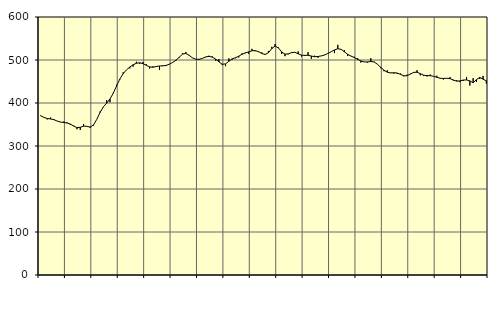
| Category | Piggar | Series 1 |
|---|---|---|
| nan | 371.2 | 370.12 |
| 87.0 | 366.7 | 366.5 |
| 87.0 | 361.9 | 363.95 |
| 87.0 | 366.2 | 362.88 |
| nan | 362.8 | 361.24 |
| 88.0 | 358.2 | 358.05 |
| 88.0 | 355.3 | 355.75 |
| 88.0 | 357 | 354.68 |
| nan | 354.8 | 353.52 |
| 89.0 | 349.2 | 350.98 |
| 89.0 | 347.4 | 346.34 |
| 89.0 | 338.9 | 342.83 |
| nan | 337.6 | 343.46 |
| 90.0 | 351.2 | 346.04 |
| 90.0 | 346.3 | 345.77 |
| 90.0 | 342 | 344.07 |
| nan | 347.7 | 348.83 |
| 91.0 | 362.1 | 361.9 |
| 91.0 | 380 | 378.06 |
| 91.0 | 390.4 | 391.03 |
| nan | 406.4 | 399.75 |
| 92.0 | 401.8 | 409.29 |
| 92.0 | 423.9 | 422.83 |
| 92.0 | 442.3 | 439.75 |
| nan | 454.7 | 455.88 |
| 93.0 | 471.4 | 468.32 |
| 93.0 | 477.1 | 477.14 |
| 93.0 | 480.5 | 483.62 |
| nan | 484.7 | 488.86 |
| 94.0 | 495.9 | 492.41 |
| 94.0 | 491.4 | 493.54 |
| 94.0 | 495.4 | 491.53 |
| nan | 490.1 | 487.62 |
| 95.0 | 480.3 | 484.05 |
| 95.0 | 485 | 483.17 |
| 95.0 | 484.4 | 484.81 |
| nan | 476.8 | 486.15 |
| 96.0 | 487.5 | 486.38 |
| 96.0 | 485.9 | 487.44 |
| 96.0 | 490 | 490.4 |
| nan | 493.9 | 494.35 |
| 97.0 | 498.6 | 499.47 |
| 97.0 | 505.2 | 506.67 |
| 97.0 | 515.9 | 513.71 |
| nan | 518.4 | 515.19 |
| 98.0 | 511.7 | 510.69 |
| 98.0 | 505.2 | 504.97 |
| 98.0 | 502.2 | 501.86 |
| nan | 500.5 | 501.54 |
| 99.0 | 503.6 | 503.77 |
| 99.0 | 507.6 | 507.08 |
| 99.0 | 509.9 | 508.47 |
| nan | 508.4 | 506.64 |
| 0.0 | 498.3 | 502.28 |
| 0.0 | 502.3 | 495.69 |
| 0.0 | 488.1 | 490.14 |
| nan | 485.7 | 491 |
| 1.0 | 503.8 | 497.09 |
| 1.0 | 500.6 | 502.7 |
| 1.0 | 504.1 | 505.24 |
| nan | 505.9 | 508.81 |
| 2.0 | 515.5 | 513.4 |
| 2.0 | 517.3 | 516.24 |
| 2.0 | 514.4 | 518.96 |
| nan | 525.9 | 521.43 |
| 3.0 | 520.5 | 521.84 |
| 3.0 | 518.3 | 519.44 |
| 3.0 | 517.5 | 515.14 |
| nan | 513.8 | 512.81 |
| 4.0 | 521 | 516.95 |
| 4.0 | 530.5 | 526.44 |
| 4.0 | 537 | 532.45 |
| nan | 529.7 | 528.13 |
| 5.0 | 514 | 518.87 |
| 5.0 | 508.9 | 513.72 |
| 5.0 | 513.1 | 514.11 |
| nan | 516.3 | 517.18 |
| 6.0 | 517.7 | 517.93 |
| 6.0 | 520 | 514.42 |
| 6.0 | 508.1 | 511.24 |
| nan | 509.4 | 510.84 |
| 7.0 | 518.2 | 510.91 |
| 7.0 | 502.9 | 509.26 |
| 7.0 | 510 | 507.58 |
| nan | 505.2 | 508.18 |
| 8.0 | 509.6 | 509.55 |
| 8.0 | 511.9 | 511.53 |
| 8.0 | 515.6 | 515.3 |
| nan | 519.3 | 519.27 |
| 9.0 | 516 | 523.38 |
| 9.0 | 535.3 | 526.19 |
| 9.0 | 525.4 | 524.84 |
| nan | 523 | 519.22 |
| 10.0 | 509.2 | 513.11 |
| 10.0 | 509.5 | 509.12 |
| 10.0 | 507.5 | 505.81 |
| nan | 504.6 | 501.72 |
| 11.0 | 494.2 | 497.81 |
| 11.0 | 495.3 | 495.49 |
| 11.0 | 493.9 | 495.51 |
| nan | 504.1 | 496.54 |
| 12.0 | 496.1 | 495.35 |
| 12.0 | 490.5 | 490.19 |
| 12.0 | 481 | 482.8 |
| nan | 473.9 | 476.23 |
| 13.0 | 475.8 | 471.67 |
| 13.0 | 469.4 | 470.04 |
| 13.0 | 468.4 | 470.37 |
| nan | 467.9 | 469.7 |
| 14.0 | 468.6 | 466.53 |
| 14.0 | 462 | 463.32 |
| 14.0 | 465.8 | 463.43 |
| nan | 468.1 | 467.24 |
| 15.0 | 470 | 471.25 |
| 15.0 | 476.1 | 471.64 |
| 15.0 | 464.5 | 468.25 |
| nan | 462.6 | 464.6 |
| 16.0 | 461.7 | 463.68 |
| 16.0 | 466.2 | 463.5 |
| 16.0 | 462.4 | 462.18 |
| nan | 463.3 | 459.83 |
| 17.0 | 456.9 | 457.62 |
| 17.0 | 454.6 | 457.08 |
| 17.0 | 457.6 | 457.52 |
| nan | 460.3 | 456.55 |
| 18.0 | 452.3 | 453.58 |
| 18.0 | 452.8 | 450.81 |
| 18.0 | 448.6 | 451.39 |
| nan | 451.4 | 453.38 |
| 19.0 | 460.5 | 453.61 |
| 19.0 | 440.6 | 451.43 |
| 19.0 | 457.7 | 446.96 |
| nan | 448.8 | 454.47 |
| 20.0 | 456.2 | 459.49 |
| 20.0 | 463 | 455.37 |
| 20.0 | 445.4 | 451.57 |